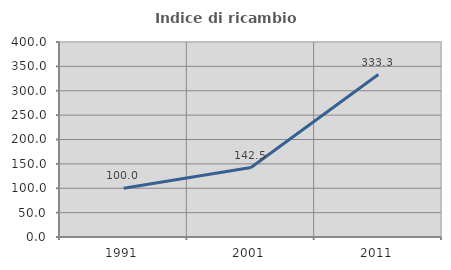
| Category | Indice di ricambio occupazionale  |
|---|---|
| 1991.0 | 100 |
| 2001.0 | 142.5 |
| 2011.0 | 333.333 |